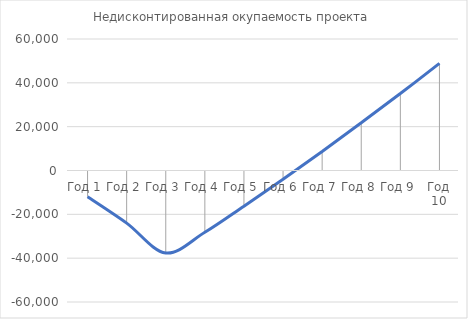
| Category | Недисконтированная окупаемость проекта |
|---|---|
| Год 1 | -12000 |
| Год 2 | -24000 |
| Год 3 | -37621.042 |
| Год 4 | -28185.069 |
| Год 5 | -16264.28 |
| Год 6 | -3971.426 |
| Год 7 | 8703.758 |
| Год 8 | 21771.795 |
| Год 9 | 35110.137 |
| Год 10 | 48864.281 |